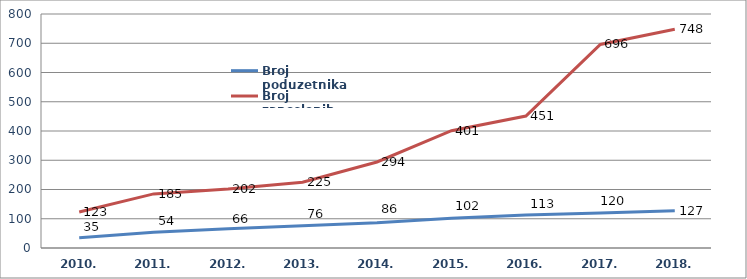
| Category | Broj poduzetnika | Broj zaposlenih |
|---|---|---|
| 2010. | 35 | 123 |
| 2011. | 54 | 185 |
| 2012. | 66 | 202 |
| 2013. | 76 | 225 |
| 2014. | 86 | 294 |
| 2015. | 102 | 401 |
| 2016. | 113 | 451 |
| 2017. | 120 | 696 |
| 2018. | 127 | 748 |